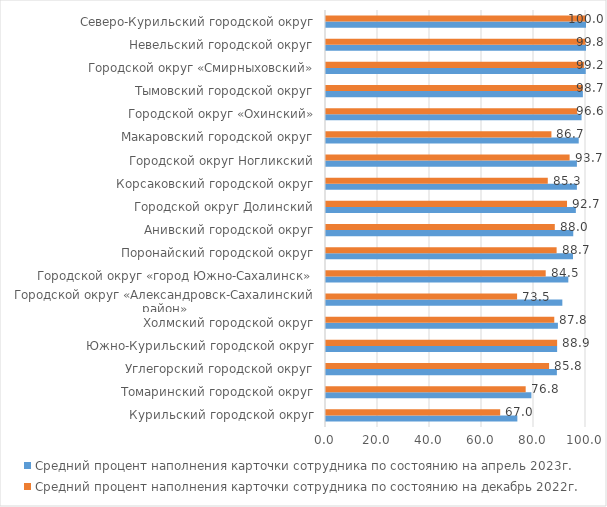
| Category | Средний процент наполнения карточки сотрудника по состоянию на апрель 2023г. | Средний процент наполнения карточки сотрудника по состоянию на декабрь 2022г. |
|---|---|---|
| Курильский городской округ | 73.6 | 67 |
| Томаринский городской округ | 79 | 76.8 |
| Углегорский городской округ | 88.8 | 85.8 |
| Южно-Курильский городской округ | 88.9 | 88.9 |
| Холмский городской округ | 89.2 | 87.8 |
| Городской округ «Александровск-Сахалинский район» | 90.9 | 73.5 |
| Городской округ «город Южно-Сахалинск» | 93.2 | 84.5 |
| Поронайский городской округ | 95 | 88.7 |
| Анивский городской округ | 95.1 | 88 |
| Городской округ Долинский | 96.1 | 92.7 |
| Корсаковский городской округ | 96.5 | 85.3 |
| Городской округ Ногликский | 96.5 | 93.7 |
| Макаровский городской округ | 97.2 | 86.7 |
| Городской округ «Охинский» | 98.3 | 96.6 |
| Тымовский городской округ | 98.8 | 98.7 |
| Городской округ «Смирныховский» | 99.9 | 99.2 |
| Невельский городской округ | 100 | 99.8 |
| Северо-Курильский городской округ | 100 | 100 |